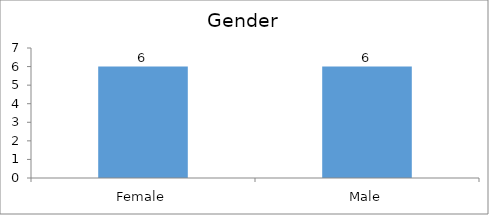
| Category | Gender |
|---|---|
| Female | 6 |
| Male | 6 |